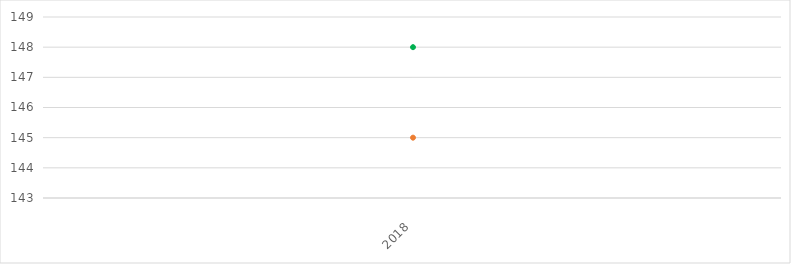
| Category | VALOR  | META PONDERADA |
|---|---|---|
| 2018 | 145 | 148 |